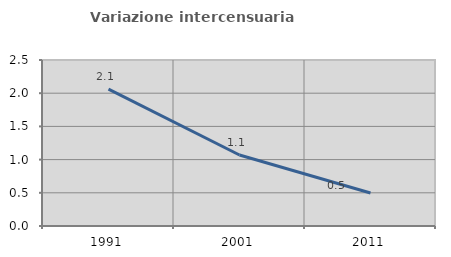
| Category | Variazione intercensuaria annua |
|---|---|
| 1991.0 | 2.061 |
| 2001.0 | 1.069 |
| 2011.0 | 0.498 |